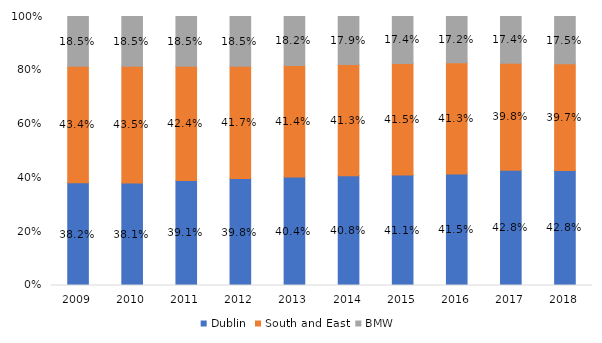
| Category | Dublin | South and East | BMW  |
|---|---|---|---|
| 2009.0 | 0.382 | 0.434 | 0.185 |
| 2010.0 | 0.381 | 0.435 | 0.185 |
| 2011.0 | 0.391 | 0.424 | 0.185 |
| 2012.0 | 0.398 | 0.417 | 0.185 |
| 2013.0 | 0.404 | 0.414 | 0.182 |
| 2014.0 | 0.408 | 0.413 | 0.179 |
| 2015.0 | 0.411 | 0.415 | 0.174 |
| 2016.0 | 0.415 | 0.413 | 0.172 |
| 2017.0 | 0.428 | 0.398 | 0.174 |
| 2018.0 | 0.428 | 0.397 | 0.175 |